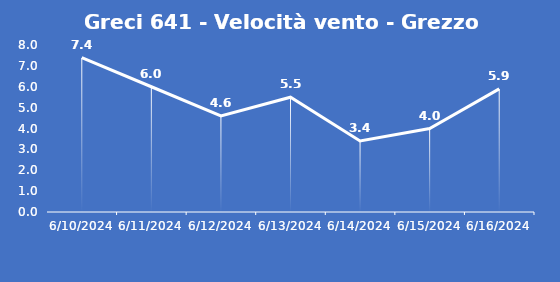
| Category | Greci 641 - Velocità vento - Grezzo (m/s) |
|---|---|
| 6/10/24 | 7.4 |
| 6/11/24 | 6 |
| 6/12/24 | 4.6 |
| 6/13/24 | 5.5 |
| 6/14/24 | 3.4 |
| 6/15/24 | 4 |
| 6/16/24 | 5.9 |